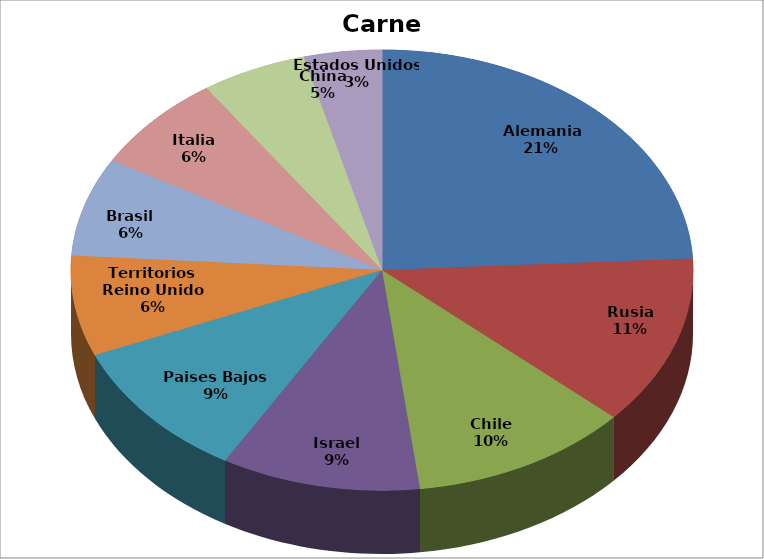
| Category | Series 0 |
|---|---|
| Alemania | 374907.441 |
| Rusia | 193391.824 |
| Chile | 177099.712 |
| Israel | 160620.578 |
| Paises Bajos | 159589.336 |
| Territorios Reino Unido | 114258.66 |
| Brasil | 112129.413 |
| Italia | 111283.128 |
| China | 85232.273 |
| Estados Unidos | 62731.558 |